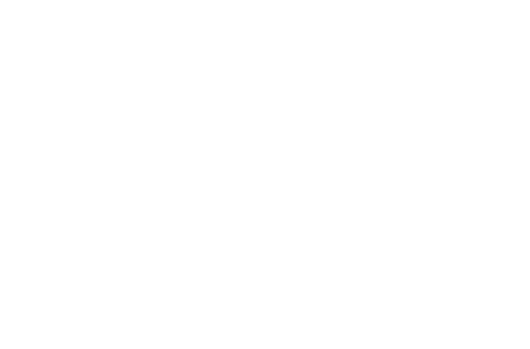
| Category | Plata principalului | Dobândă plătită |
|---|---|---|
| 2019 | 316.351 | 226.28 |
| 2020 | 1105.769 | 739.178 |
| 2021 | 1939.715 | 1207.547 |
| 2022 | 2820.703 | 1628.874 |
| 2023 | 3751.386 | 2000.507 |
| 2024 | 4734.566 | 2319.642 |
| 2025 | 5773.206 | 2583.318 |
| 2026 | 6870.433 | 2788.406 |
| 2027 | 8029.552 | 2931.602 |
| 2028 | 9254.054 | 3009.415 |
| 2029 | 10000 | 3023.153 |